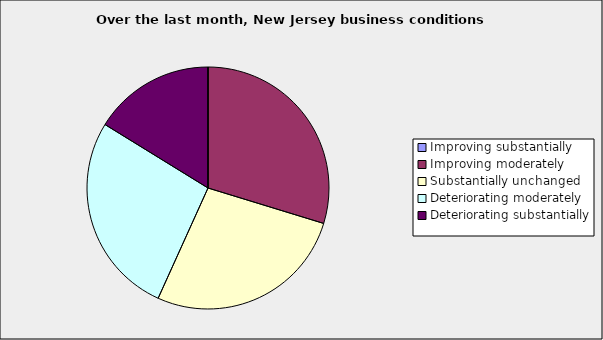
| Category | Series 0 |
|---|---|
| Improving substantially | 0 |
| Improving moderately | 0.297 |
| Substantially unchanged | 0.27 |
| Deteriorating moderately | 0.27 |
| Deteriorating substantially | 0.162 |